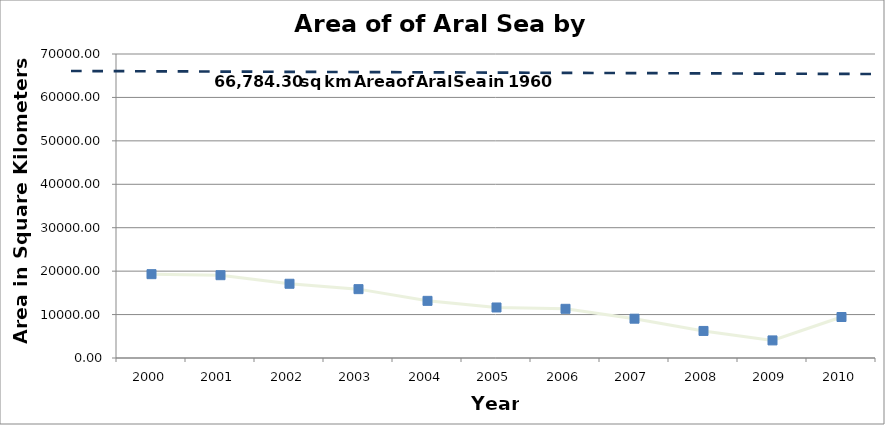
| Category | "Area of  Sea in Sq Km" |
|---|---|
| 2000 | 19304.85 |
| 2001 | 19068.52 |
| 2002 | 17095.03 |
| 2003 | 15854.59 |
| 2004 | 13159.37 |
| 2005 | 11633.72 |
| 2006 | 11324.05 |
| 2007 | 9049.39 |
| 2008 | 6228.74 |
| 2009 | 4049.74 |
| 2010 | 9437.36 |